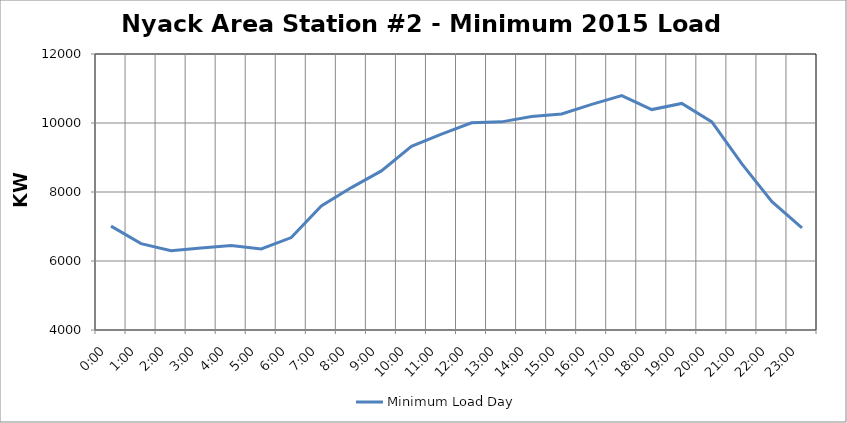
| Category | Minimum Load Day |
|---|---|
| 0.0 | 7010.4 |
| 0.041666666666666664 | 6502.4 |
| 0.08333333333333333 | 6299.2 |
| 0.125 | 6375.4 |
| 0.16666666666666666 | 6451.6 |
| 0.20833333333333334 | 6350 |
| 0.25 | 6680.2 |
| 0.2916666666666667 | 7594.6 |
| 0.3333333333333333 | 8128 |
| 0.375 | 8610.6 |
| 0.4166666666666667 | 9321.8 |
| 0.4583333333333333 | 9677.4 |
| 0.5 | 10007.6 |
| 0.5416666666666666 | 10033 |
| 0.5833333333333334 | 10185.4 |
| 0.625 | 10261.6 |
| 0.6666666666666666 | 10541 |
| 0.7083333333333334 | 10795 |
| 0.75 | 10388.6 |
| 0.7916666666666666 | 10566.4 |
| 0.8333333333333334 | 10033 |
| 0.875 | 8813.8 |
| 0.9166666666666666 | 7721.6 |
| 0.9583333333333334 | 6959.6 |